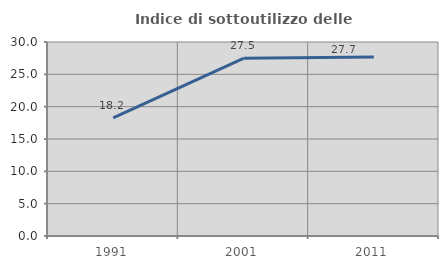
| Category | Indice di sottoutilizzo delle abitazioni  |
|---|---|
| 1991.0 | 18.249 |
| 2001.0 | 27.468 |
| 2011.0 | 27.681 |